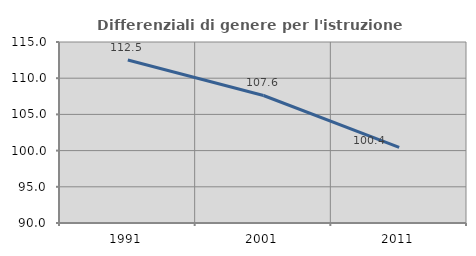
| Category | Differenziali di genere per l'istruzione superiore |
|---|---|
| 1991.0 | 112.519 |
| 2001.0 | 107.612 |
| 2011.0 | 100.436 |